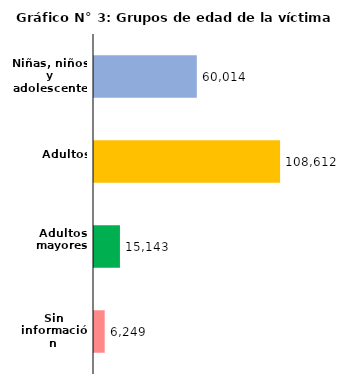
| Category | Series 0 |
|---|---|
| Niñas, niños y adolescentes | 60014 |
| Adultos | 108612 |
| Adultos mayores | 15143 |
| Sin información | 6249 |